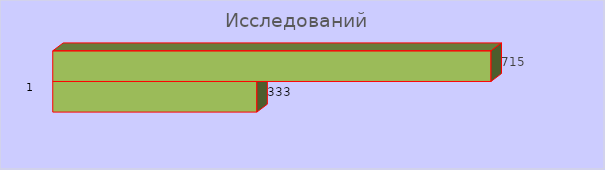
| Category | исследований |
|---|---|
| 0 | 715 |